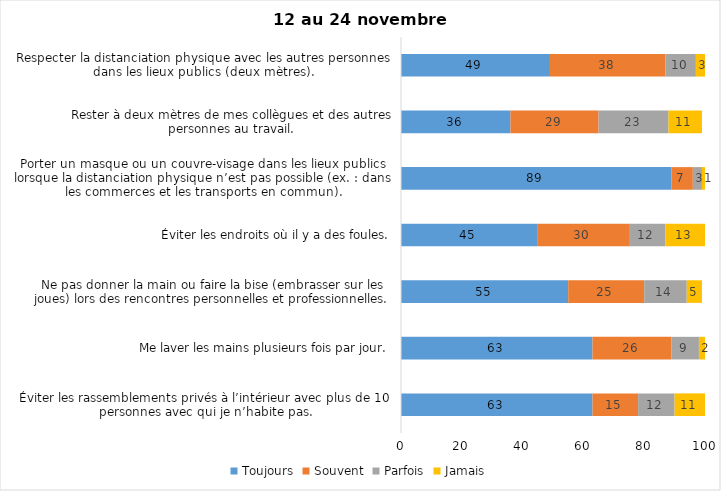
| Category | Toujours | Souvent | Parfois | Jamais |
|---|---|---|---|---|
| Éviter les rassemblements privés à l’intérieur avec plus de 10 personnes avec qui je n’habite pas. | 63 | 15 | 12 | 11 |
| Me laver les mains plusieurs fois par jour. | 63 | 26 | 9 | 2 |
| Ne pas donner la main ou faire la bise (embrasser sur les joues) lors des rencontres personnelles et professionnelles. | 55 | 25 | 14 | 5 |
| Éviter les endroits où il y a des foules. | 45 | 30 | 12 | 13 |
| Porter un masque ou un couvre-visage dans les lieux publics lorsque la distanciation physique n’est pas possible (ex. : dans les commerces et les transports en commun). | 89 | 7 | 3 | 1 |
| Rester à deux mètres de mes collègues et des autres personnes au travail. | 36 | 29 | 23 | 11 |
| Respecter la distanciation physique avec les autres personnes dans les lieux publics (deux mètres). | 49 | 38 | 10 | 3 |